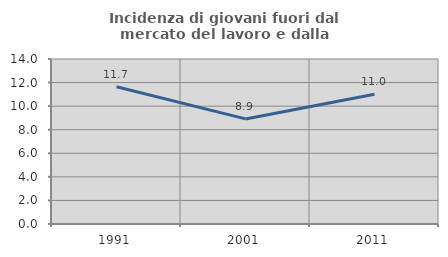
| Category | Incidenza di giovani fuori dal mercato del lavoro e dalla formazione  |
|---|---|
| 1991.0 | 11.651 |
| 2001.0 | 8.916 |
| 2011.0 | 11.007 |